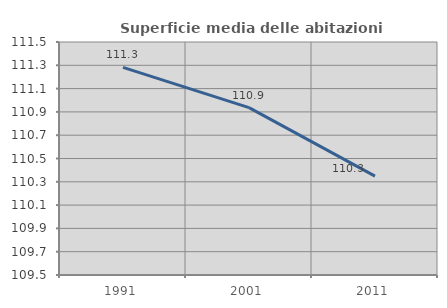
| Category | Superficie media delle abitazioni occupate |
|---|---|
| 1991.0 | 111.282 |
| 2001.0 | 110.937 |
| 2011.0 | 110.349 |